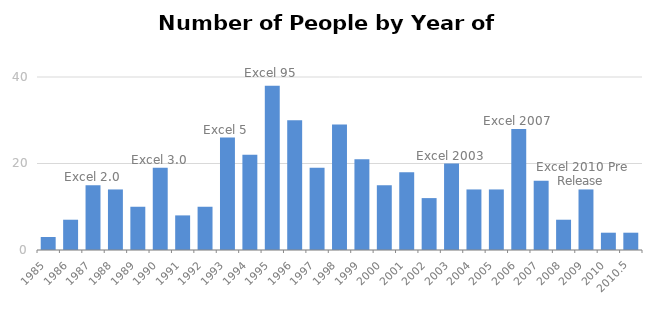
| Category | Number of People |
|---|---|
| 2010.5 | 4 |
| 2010.0 | 4 |
| 2009.0 | 14 |
| 2008.0 | 7 |
| 2007.0 | 16 |
| 2006.0 | 28 |
| 2005.0 | 14 |
| 2004.0 | 14 |
| 2003.0 | 20 |
| 2002.0 | 12 |
| 2001.0 | 18 |
| 2000.0 | 15 |
| 1999.0 | 21 |
| 1998.0 | 29 |
| 1997.0 | 19 |
| 1996.0 | 30 |
| 1995.0 | 38 |
| 1994.0 | 22 |
| 1993.0 | 26 |
| 1992.0 | 10 |
| 1991.0 | 8 |
| 1990.0 | 19 |
| 1989.0 | 10 |
| 1988.0 | 14 |
| 1987.0 | 15 |
| 1986.0 | 7 |
| 1985.0 | 3 |